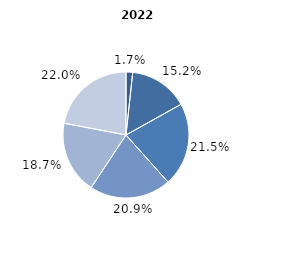
| Category | 2022 |
|---|---|
| până la 25 ani | 1.7 |
| 25-34 ani | 15.2 |
| 35-44 ani | 21.5 |
| 45-54 ani | 20.9 |
| 55-64 ani | 18.7 |
| 65 ani şi peste | 22 |